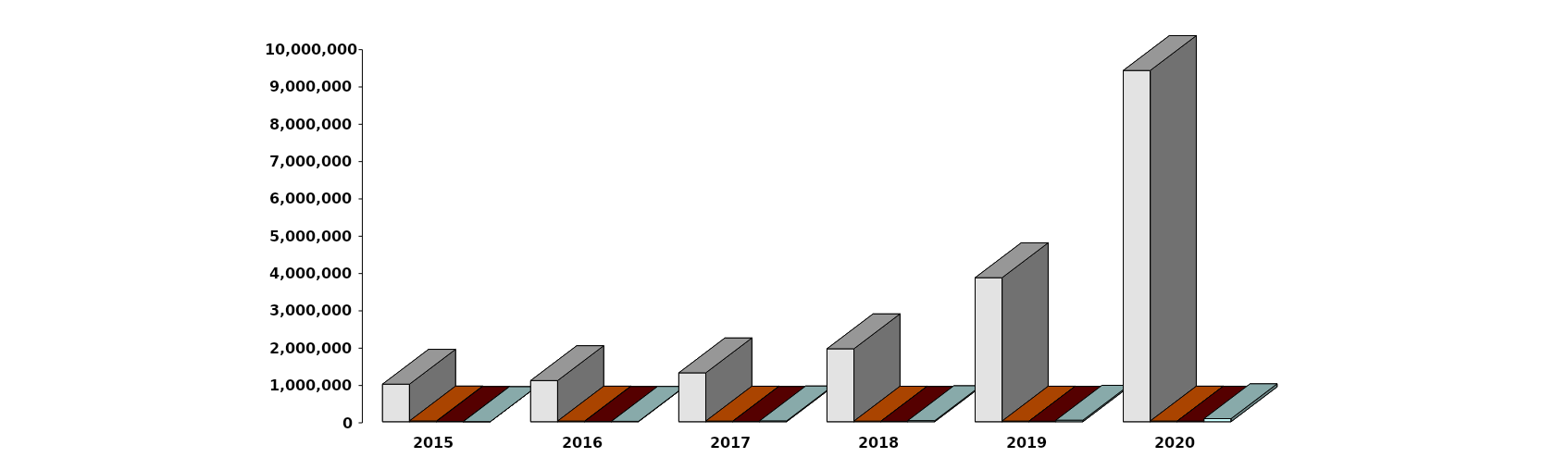
| Category | Физические лица | Юридические лица | Иностранные лица | Клиенты, передавшие свои средства в ДУ |
|---|---|---|---|---|
| 2015-12-31 | 1006751 | 20753 | 8729 | 3836 |
| 2016-12-31 | 1102966 | 18622 | 9215 | 10694 |
| 2017-12-31 | 1310296 | 17766 | 10211 | 22564 |
| 2018-12-31 | 1955118 | 16631 | 11453 | 29262 |
| 2019-12-31 | 3859911 | 17695 | 14011 | 41535 |
| 2020-12-31 | 9412672 | 19074 | 17041 | 82193 |